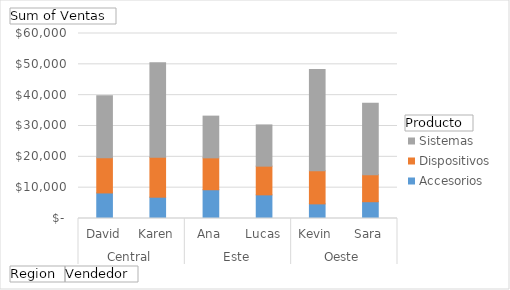
| Category | Accesorios | Dispositivos | Sistemas |
|---|---|---|---|
| 0 | 8287 | 11420 | 20098 |
| 1 | 6909 | 12948 | 30633 |
| 2 | 9323 | 10348 | 13531 |
| 3 | 7667 | 9312 | 13374 |
| 4 | 4744 | 10711 | 32855 |
| 5 | 5442 | 8780 | 23151 |